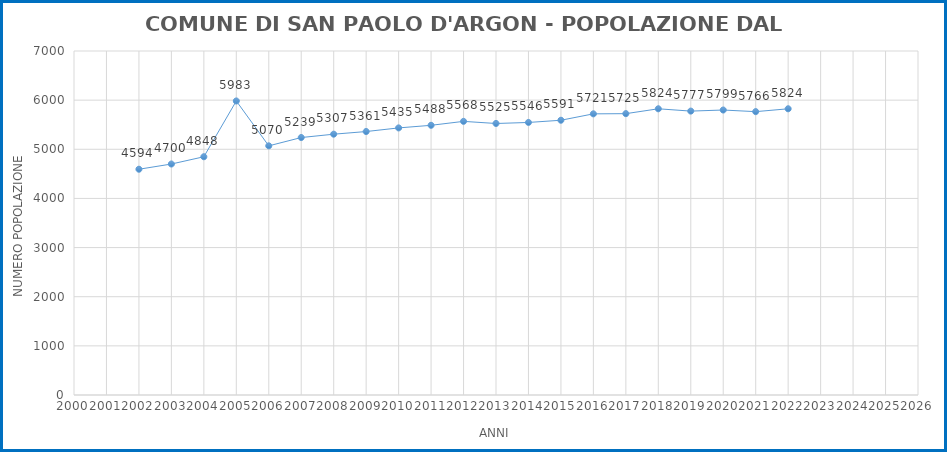
| Category |  POPOLAZIONE |
|---|---|
| 2002.0 | 4594 |
| 2003.0 | 4700 |
| 2004.0 | 4848 |
| 2005.0 | 5983 |
| 2006.0 | 5070 |
| 2007.0 | 5239 |
| 2008.0 | 5307 |
| 2009.0 | 5361 |
| 2010.0 | 5435 |
| 2011.0 | 5488 |
| 2012.0 | 5568 |
| 2013.0 | 5525 |
| 2014.0 | 5546 |
| 2015.0 | 5591 |
| 2016.0 | 5721 |
| 2017.0 | 5725 |
| 2018.0 | 5824 |
| 2019.0 | 5777 |
| 2020.0 | 5799 |
| 2021.0 | 5766 |
| 2022.0 | 5824 |